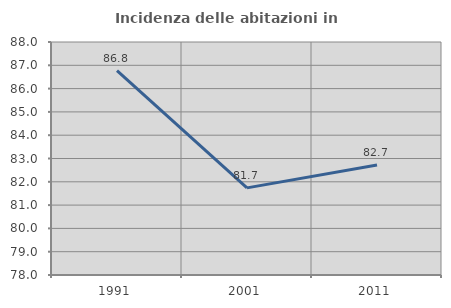
| Category | Incidenza delle abitazioni in proprietà  |
|---|---|
| 1991.0 | 86.768 |
| 2001.0 | 81.739 |
| 2011.0 | 82.724 |